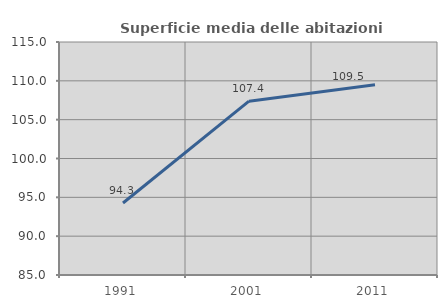
| Category | Superficie media delle abitazioni occupate |
|---|---|
| 1991.0 | 94.269 |
| 2001.0 | 107.384 |
| 2011.0 | 109.486 |